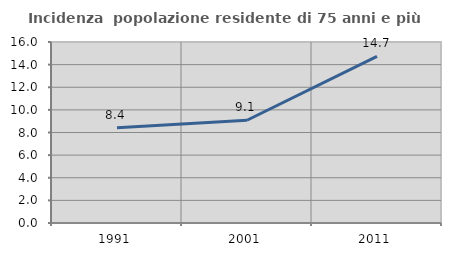
| Category | Incidenza  popolazione residente di 75 anni e più |
|---|---|
| 1991.0 | 8.431 |
| 2001.0 | 9.084 |
| 2011.0 | 14.727 |